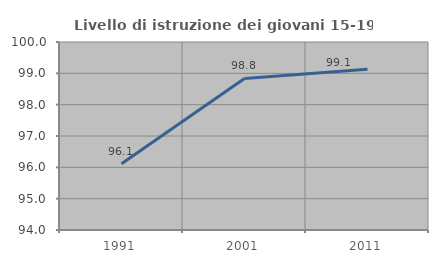
| Category | Livello di istruzione dei giovani 15-19 anni |
|---|---|
| 1991.0 | 96.117 |
| 2001.0 | 98.837 |
| 2011.0 | 99.13 |